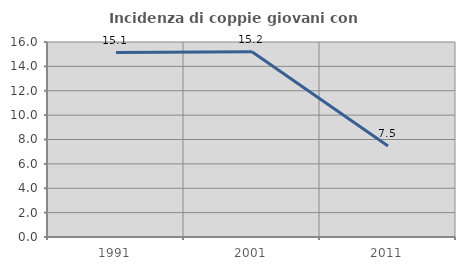
| Category | Incidenza di coppie giovani con figli |
|---|---|
| 1991.0 | 15.137 |
| 2001.0 | 15.209 |
| 2011.0 | 7.458 |